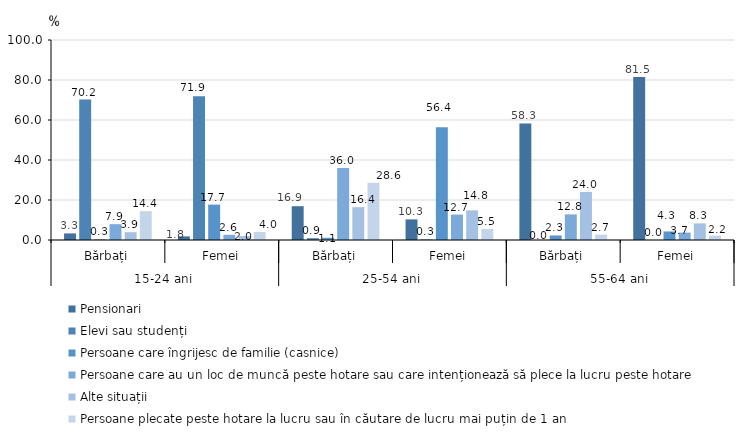
| Category | Pensionari | Elevi sau studenți | Persoane care îngrijesc de familie (casnice) | Persoane care au un loc de muncă peste hotare sau care intenționează să plece la lucru peste hotare | Alte situații | Persoane plecate peste hotare la lucru sau în căutare de lucru mai puțin de 1 an |
|---|---|---|---|---|---|---|
| 0 | 3.3 | 70.2 | 0.3 | 7.9 | 3.9 | 14.4 |
| 1 | 1.8 | 71.9 | 17.7 | 2.6 | 2 | 4 |
| 2 | 16.9 | 0.9 | 1.1 | 36 | 16.4 | 28.6 |
| 3 | 10.3 | 0.3 | 56.4 | 12.7 | 14.8 | 5.5 |
| 4 | 58.3 | 0 | 2.266 | 12.8 | 24 | 2.7 |
| 5 | 81.5 | 0 | 4.269 | 3.7 | 8.3 | 2.2 |